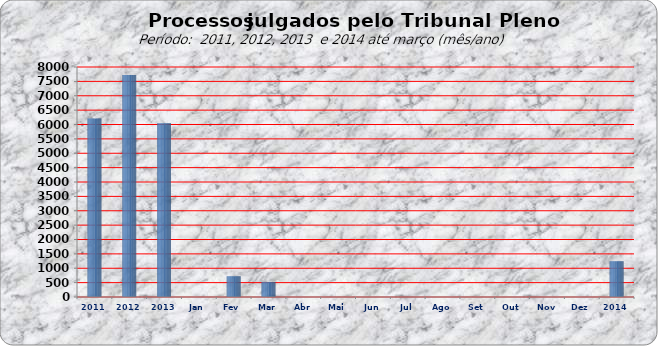
| Category | 6205 7722 6043 0 721 524 0 0 0 0 0 0 0 0 0 |
|---|---|
| 2011 | 6205 |
| 2012 | 7722 |
| 2013 | 6043 |
| Jan | 0 |
| Fev | 721 |
| Mar | 524 |
| Abr | 0 |
| Mai | 0 |
| Jun | 0 |
| Jul | 0 |
| Ago | 0 |
| Set | 0 |
| Out | 0 |
| Nov | 0 |
| Dez | 0 |
| 2014 | 1245 |